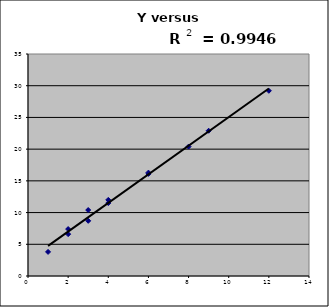
| Category | Y |
|---|---|
| 1.0 | 3.8 |
| 2.0 | 6.6 |
| 3.0 | 8.7 |
| 4.0 | 12 |
| 2.0 | 7.4 |
| 4.0 | 11.5 |
| 6.0 | 16.3 |
| 8.0 | 20.4 |
| 3.0 | 10.4 |
| 6.0 | 16.1 |
| 9.0 | 22.9 |
| 12.0 | 29.2 |